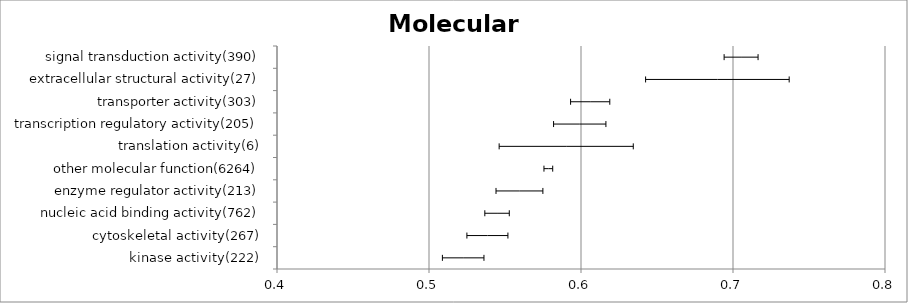
| Category | Series 0 |
|---|---|
|  kinase activity(222) | 0.522 |
|  cytoskeletal activity(267) | 0.538 |
|  nucleic acid binding activity(762) | 0.545 |
|  enzyme regulator activity(213) | 0.56 |
|  other molecular function(6264) | 0.579 |
|  translation activity(6) | 0.59 |
|  transcription regulatory activity(205) | 0.599 |
|  transporter activity(303) | 0.606 |
|  extracellular structural activity(27) | 0.69 |
|  signal transduction activity(390) | 0.705 |